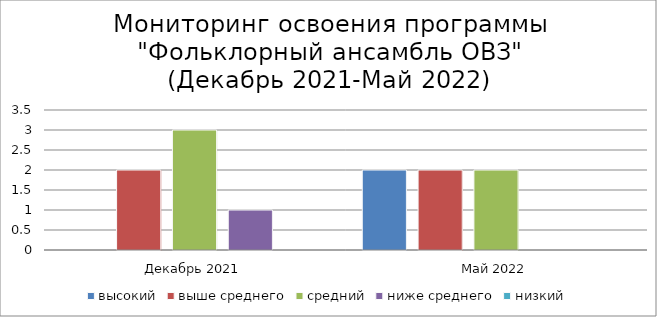
| Category | высокий | выше среднего | средний | ниже среднего | низкий |
|---|---|---|---|---|---|
| Декабрь 2021 | 0 | 2 | 3 | 1 | 0 |
| Май 2022 | 2 | 2 | 2 | 0 | 0 |